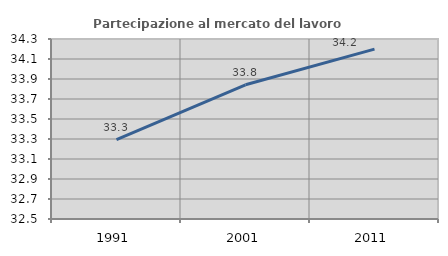
| Category | Partecipazione al mercato del lavoro  femminile |
|---|---|
| 1991.0 | 33.294 |
| 2001.0 | 33.842 |
| 2011.0 | 34.199 |